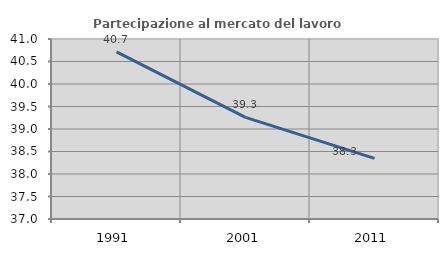
| Category | Partecipazione al mercato del lavoro  femminile |
|---|---|
| 1991.0 | 40.714 |
| 2001.0 | 39.259 |
| 2011.0 | 38.346 |